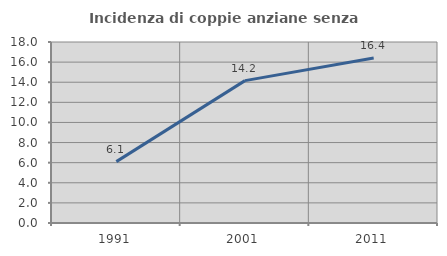
| Category | Incidenza di coppie anziane senza figli  |
|---|---|
| 1991.0 | 6.103 |
| 2001.0 | 14.159 |
| 2011.0 | 16.4 |